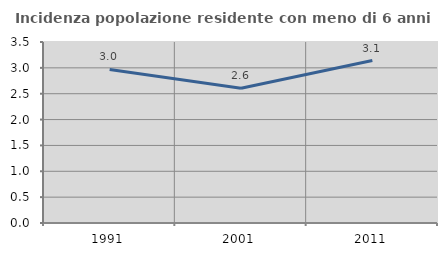
| Category | Incidenza popolazione residente con meno di 6 anni |
|---|---|
| 1991.0 | 2.97 |
| 2001.0 | 2.604 |
| 2011.0 | 3.141 |